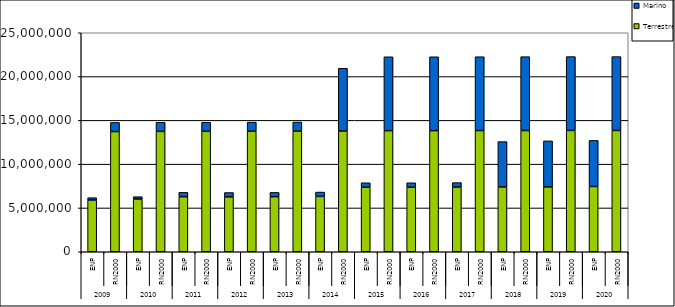
| Category | Terrestre | Marino |
|---|---|---|
| 0 | 5908859.398 | 266016.425 |
| 1 | 13719811.817 | 1043748.295 |
| 2 | 6022675.009 | 265807.201 |
| 3 | 13738572.132 | 1043627.61 |
| 4 | 6285291.148 | 496953.086 |
| 5 | 13748058.309 | 1035475.244 |
| 6 | 6265278.145 | 495244.49 |
| 7 | 13763064.804 | 1034992.765 |
| 8 | 6286152.796 | 488307.222 |
| 9 | 13778251.976 | 1028089.679 |
| 10 | 6316313.942 | 500808.803 |
| 11 | 13783417.466 | 7159304.664 |
| 12 | 7363769 | 511448 |
| 13 | 13825030 | 8432232 |
| 14 | 7363769.056 | 511447.998 |
| 15 | 13825029.749 | 8432232.278 |
| 16 | 7383423.682 | 511446.587 |
| 17 | 13833014.676 | 8432232.304 |
| 18 | 7402026.851 | 5175131.058 |
| 19 | 13839509.365 | 8432215.426 |
| 20 | 7403238.598 | 5256610.799 |
| 21 | 13849073.283 | 8432208.524 |
| 22 | 7455092.462 | 5257161.118 |
| 23 | 13846016.345 | 8432199.357 |